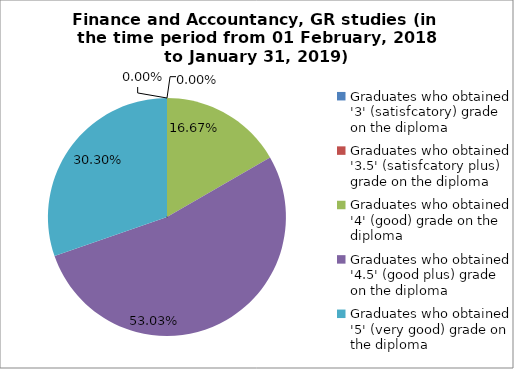
| Category | Series 0 |
|---|---|
| Graduates who obtained '3' (satisfcatory) grade on the diploma | 0 |
| Graduates who obtained '3.5' (satisfcatory plus) grade on the diploma | 0 |
| Graduates who obtained '4' (good) grade on the diploma | 16.667 |
| Graduates who obtained '4.5' (good plus) grade on the diploma | 53.03 |
| Graduates who obtained '5' (very good) grade on the diploma | 30.303 |